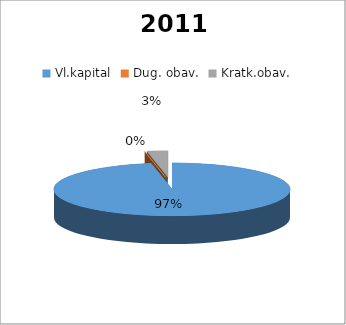
| Category | 2011 |
|---|---|
| Vl.kapital | 2502558 |
| Dug. obav. | 0 |
| Kratk.obav. | 73052 |